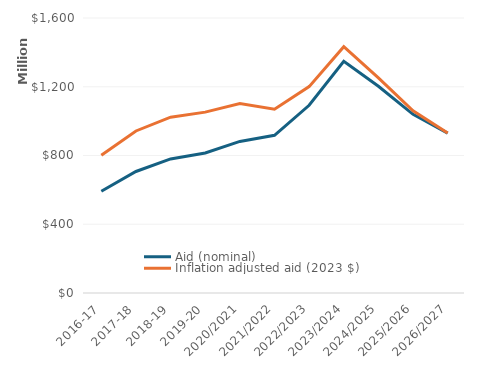
| Category | Aid (nominal) | Inflation adjusted aid (2023 $) |
|---|---|---|
| 2016-17 | 592219000 | 801517595.749 |
| 2017-18 | 706997000 | 942718984.41 |
| 2018-19 | 780223000 | 1022969010.905 |
| 2019-20 | 814630000 | 1052296404.35 |
| 2020/2021 | 882017000 | 1102946180.623 |
| 2021/2022 | 917299000 | 1069026727.385 |
| 2022/2023 | 1092138000 | 1200740878.972 |
| 2023/2024 | 1347764000 | 1433062366.243 |
| 2024/2025 | 1203010000 | 1251611604 |
| 2025/2026 | 1039459779.76 | 1060248975.355 |
| 2026/2027 | 930426299.599 | 930426299.599 |